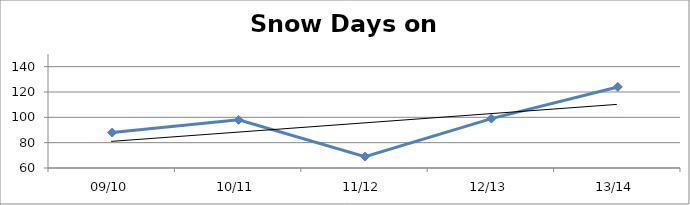
| Category | Snow Days on Ground |
|---|---|
| 09/10 | 88 |
| 10/11 | 98 |
| 11/12 | 69 |
| 12/13 | 99 |
| 13/14 | 124 |